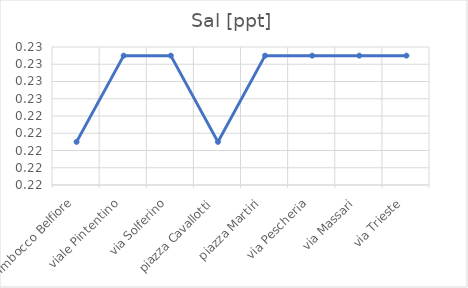
| Category | Sal [ppt] |
|---|---|
| Imbocco Belfiore | 0.22 |
| viale Pintentino | 0.23 |
| via Solferino | 0.23 |
| piazza Cavallotti | 0.22 |
| piazza Martiri | 0.23 |
| via Pescheria | 0.23 |
| via Massari | 0.23 |
| via Trieste | 0.23 |